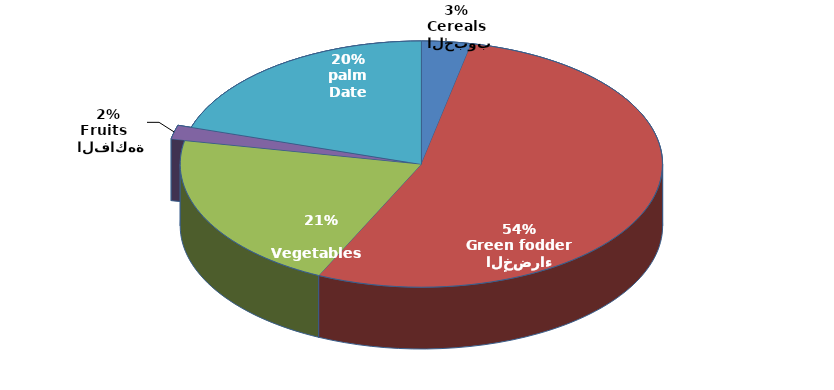
| Category | Series 0 |
|---|---|
|  الحبوب
Cereals | 0.033 |
| الأعلاف الخضراء
Green fodder | 0.537 |
| الخضروات
Vegetables     | 0.211 |
|  الفاكهة
Fruits   | 0.018 |
|  النخيل
Date palm | 0.201 |